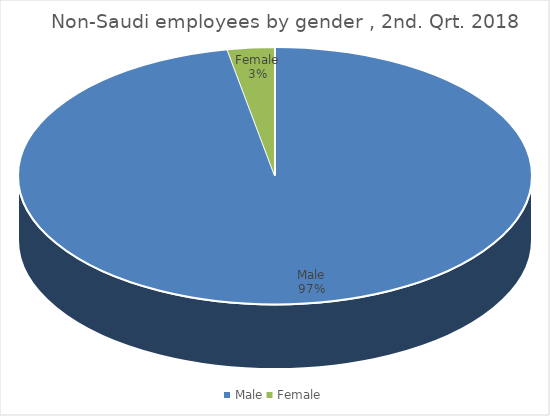
| Category | Series 0 |
|---|---|
| Male | 4626453 |
| Female | 141590 |